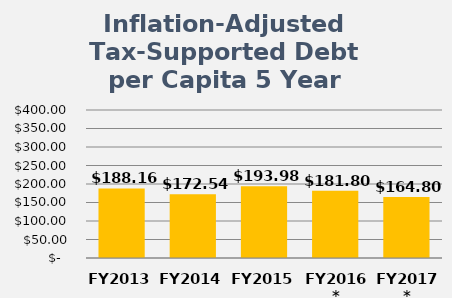
| Category | Series 0 |
|---|---|
| FY2013 | 188.16 |
| FY2014 | 172.54 |
| FY2015 | 193.98 |
| FY2016* | 181.8 |
| FY2017* | 164.8 |